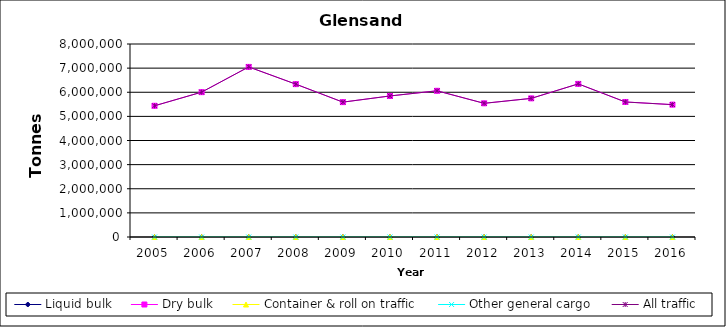
| Category | Liquid bulk | Dry bulk | Container & roll on traffic | Other general cargo | All traffic |
|---|---|---|---|---|---|
| 2005.0 | 0 | 5439000 | 0 | 0 | 5439000 |
| 2006.0 | 0 | 6004000 | 0 | 0 | 6004000 |
| 2007.0 | 0 | 7050000 | 0 | 0 | 7050000 |
| 2008.0 | 0 | 6336000 | 0 | 0 | 6336000 |
| 2009.0 | 0 | 5590653 | 0 | 0 | 5590653 |
| 2010.0 | 0 | 5846000 | 0 | 0 | 5846000 |
| 2011.0 | 0 | 6060000 | 0 | 0 | 6060000 |
| 2012.0 | 0 | 5541000 | 0 | 0 | 5541000 |
| 2013.0 | 0 | 5746000 | 0 | 0 | 5746000 |
| 2014.0 | 0 | 6347000 | 0 | 0 | 6347000 |
| 2015.0 | 0 | 5597000 | 0 | 0 | 5597000 |
| 2016.0 | 0 | 5487000 | 0 | 0 | 5487000 |